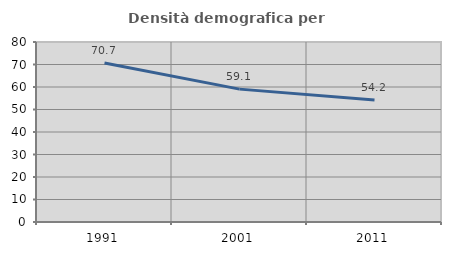
| Category | Densità demografica |
|---|---|
| 1991.0 | 70.671 |
| 2001.0 | 59.055 |
| 2011.0 | 54.243 |